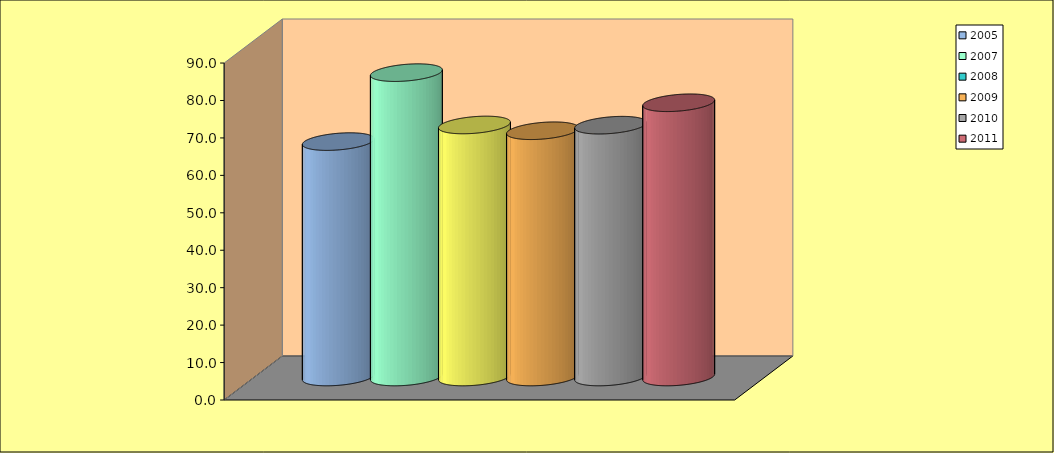
| Category | 2005 | 2007 | 2008 | 2009 | 2010 | 2011 |
|---|---|---|---|---|---|---|
| 0 | 62.877 | 81.293 | 67.316 | 65.775 | 67.26 | 73.249 |